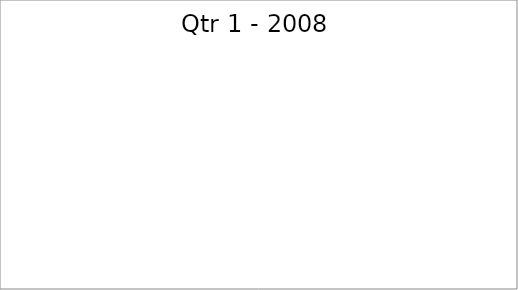
| Category | Series 0 |
|---|---|
| Budget | 1580 |
| Projected | 2420 |
| Actual | 1610 |
| Forecast | 660 |